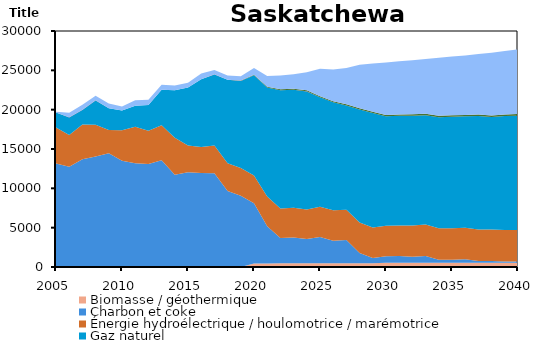
| Category | Biomasse / géothermique | Charbon et coke | Énergie hydroélectrique / houlomotrice / marémotrice | Gaz naturel | Pétrole | Solaire | Uranium | Éolien |
|---|---|---|---|---|---|---|---|---|
| 2005.0 | 0 | 13157.72 | 4573 | 1896.283 | 17.9 | 0 | 0 | 92 |
| 2006.0 | 0 | 12734.72 | 4032 | 2247.283 | 19.5 | 0 | 0 | 573 |
| 2007.0 | 0 | 13706.72 | 4393 | 1869.283 | 25.9 | 0 | 0 | 620 |
| 2008.0 | 0 | 14055.07 | 4030 | 3083.935 | 22.6 | 0 | 0 | 574 |
| 2009.0 | 0 | 14446.21 | 2962 | 2763.792 | 17.9 | 0 | 0 | 579 |
| 2010.0 | 0 | 13510.41 | 3866 | 2503.593 | 20.8 | 0 | 0 | 507 |
| 2011.0 | 0 | 13181.21 | 4641 | 2678.787 | 12.3 | 0 | 0 | 682 |
| 2012.0 | 0 | 13089.82 | 4240 | 3253.184 | 11.3 | 0 | 0 | 655 |
| 2013.0 | 0 | 13578.27 | 4449 | 4493.73 | 15 | 0 | 0 | 646 |
| 2014.0 | 0 | 11726.75 | 4706.09 | 6022.449 | 12.4 | 0 | 0 | 615.264 |
| 2015.0 | 0 | 12030.72 | 3425.611 | 7352.383 | 2 | 0 | 0 | 619.832 |
| 2016.0 | 0 | 11961.09 | 3284.769 | 8614.611 | 1.1 | 0 | 0 | 730.283 |
| 2017.0 | 0 | 11920.31 | 3525 | 9040.29 | 1.2 | 0 | 0 | 542.11 |
| 2018.0 | 0 | 9671.481 | 3525.01 | 10592.28 | 8.199 | 0 | 0 | 542.112 |
| 2019.0 | 0 | 9047.66 | 3524.996 | 11084.91 | 8.199 | 35.04 | 0 | 542.109 |
| 2020.0 | 437.999 | 7670.2 | 3524.994 | 12729.59 | 8.199 | 70.08 | 0 | 848.708 |
| 2021.0 | 437.998 | 4755.693 | 3759.108 | 13853.93 | 8.199 | 105.12 | 0 | 1348.768 |
| 2022.0 | 481.798 | 3198.948 | 3759.099 | 15012.67 | 8.199 | 131.4 | 0 | 1737.161 |
| 2023.0 | 481.799 | 3282.606 | 3759.119 | 15002.73 | 8.199 | 131.4 | 0 | 1824.169 |
| 2024.0 | 481.799 | 3077.798 | 3759.153 | 15005.53 | 8.199 | 131.4 | 0 | 2297.206 |
| 2025.0 | 481.801 | 3329.343 | 3862.273 | 13890.58 | 0.083 | 131.4 | 0 | 3491.768 |
| 2026.0 | 481.8 | 2859.033 | 3862.291 | 13727.64 | 0.083 | 131.4 | 0 | 4054.135 |
| 2027.0 | 481.8 | 2945.776 | 3862.292 | 13232.59 | 0.083 | 157.68 | 0 | 4617.093 |
| 2028.0 | 481.8 | 1301.378 | 3862.292 | 14378.05 | 0.083 | 157.68 | 0 | 5540.767 |
| 2029.0 | 481.799 | 661.982 | 3862.285 | 14580.2 | 0.083 | 157.68 | 0 | 6109.91 |
| 2030.0 | 525.599 | 843.19 | 3862.309 | 13937.97 | 0.083 | 157.68 | 0 | 6679.284 |
| 2031.0 | 525.601 | 877.692 | 3862.291 | 13966.71 | 0.083 | 157.68 | 0 | 6775.755 |
| 2032.0 | 525.6 | 787.271 | 3965.427 | 13954.01 | 0.083 | 183.96 | 0 | 6872.534 |
| 2033.0 | 525.601 | 880.409 | 4001.367 | 13888.46 | 0.083 | 183.96 | 0 | 6967.61 |
| 2034.0 | 525.601 | 406.563 | 4001.336 | 14109.75 | 0.083 | 183.96 | 0 | 7369.602 |
| 2035.0 | 525.6 | 411.773 | 4001.377 | 14167.3 | 0.083 | 183.96 | 0 | 7466.247 |
| 2036.0 | 525.6 | 458.651 | 4001.391 | 14167.96 | 0.083 | 183.96 | 0 | 7563.765 |
| 2037.0 | 525.599 | 247.242 | 4001.384 | 14414.81 | 0.083 | 210.24 | 0 | 7661.881 |
| 2038.0 | 525.599 | 247.242 | 4001.386 | 14279.11 | 0.083 | 210.24 | 0 | 7968.488 |
| 2039.0 | 525.6 | 172.866 | 4001.333 | 14482.17 | 0.083 | 210.24 | 0 | 8079.412 |
| 2040.0 | 525.6 | 172.866 | 4001.326 | 14543 | 0.083 | 210.24 | 0 | 8193.141 |